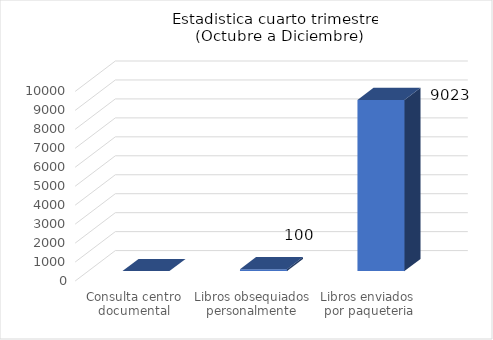
| Category | Enero a Marzo |
|---|---|
| Consulta centro documental | 0 |
| Libros obsequiados personalmente | 100 |
| Libros enviados  por paqueteria | 9023 |